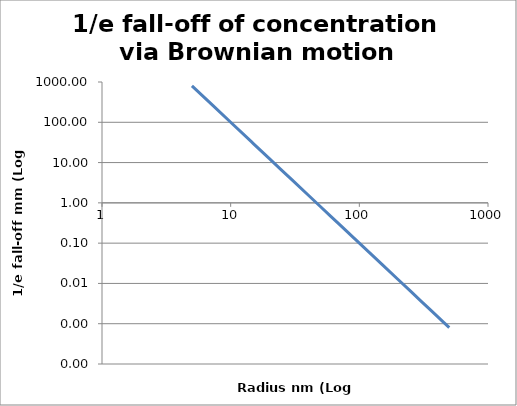
| Category | Series 0 |
|---|---|
| 5.0 | 801 |
| 10.0 | 100.125 |
| 15.0 | 29.667 |
| 20.0 | 12.516 |
| 30.0 | 3.708 |
| 40.0 | 1.564 |
| 50.0 | 0.801 |
| 60.0 | 0.464 |
| 70.0 | 0.292 |
| 80.0 | 0.196 |
| 90.0 | 0.137 |
| 100.0 | 0.1 |
| 150.0 | 0.03 |
| 200.0 | 0.013 |
| 250.0 | 0.006 |
| 300.0 | 0.004 |
| 350.0 | 0.002 |
| 400.0 | 0.002 |
| 450.0 | 0.001 |
| 500.0 | 0.001 |